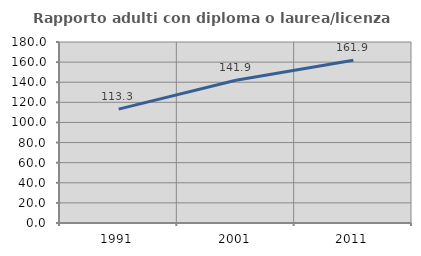
| Category | Rapporto adulti con diploma o laurea/licenza media  |
|---|---|
| 1991.0 | 113.282 |
| 2001.0 | 141.945 |
| 2011.0 | 161.936 |